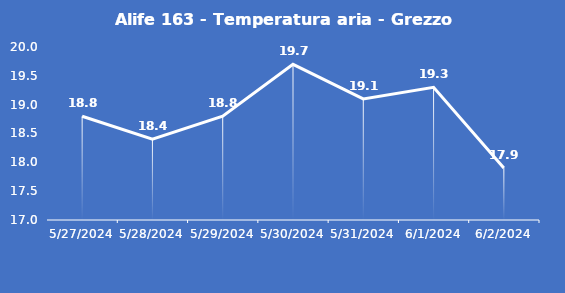
| Category | Alife 163 - Temperatura aria - Grezzo (°C) |
|---|---|
| 5/27/24 | 18.8 |
| 5/28/24 | 18.4 |
| 5/29/24 | 18.8 |
| 5/30/24 | 19.7 |
| 5/31/24 | 19.1 |
| 6/1/24 | 19.3 |
| 6/2/24 | 17.9 |